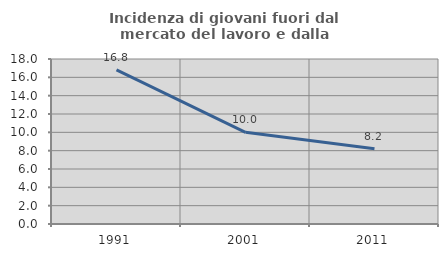
| Category | Incidenza di giovani fuori dal mercato del lavoro e dalla formazione  |
|---|---|
| 1991.0 | 16.814 |
| 2001.0 | 10 |
| 2011.0 | 8.219 |